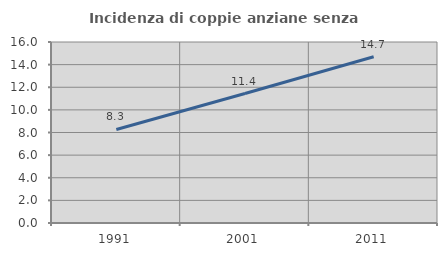
| Category | Incidenza di coppie anziane senza figli  |
|---|---|
| 1991.0 | 8.267 |
| 2001.0 | 11.445 |
| 2011.0 | 14.693 |